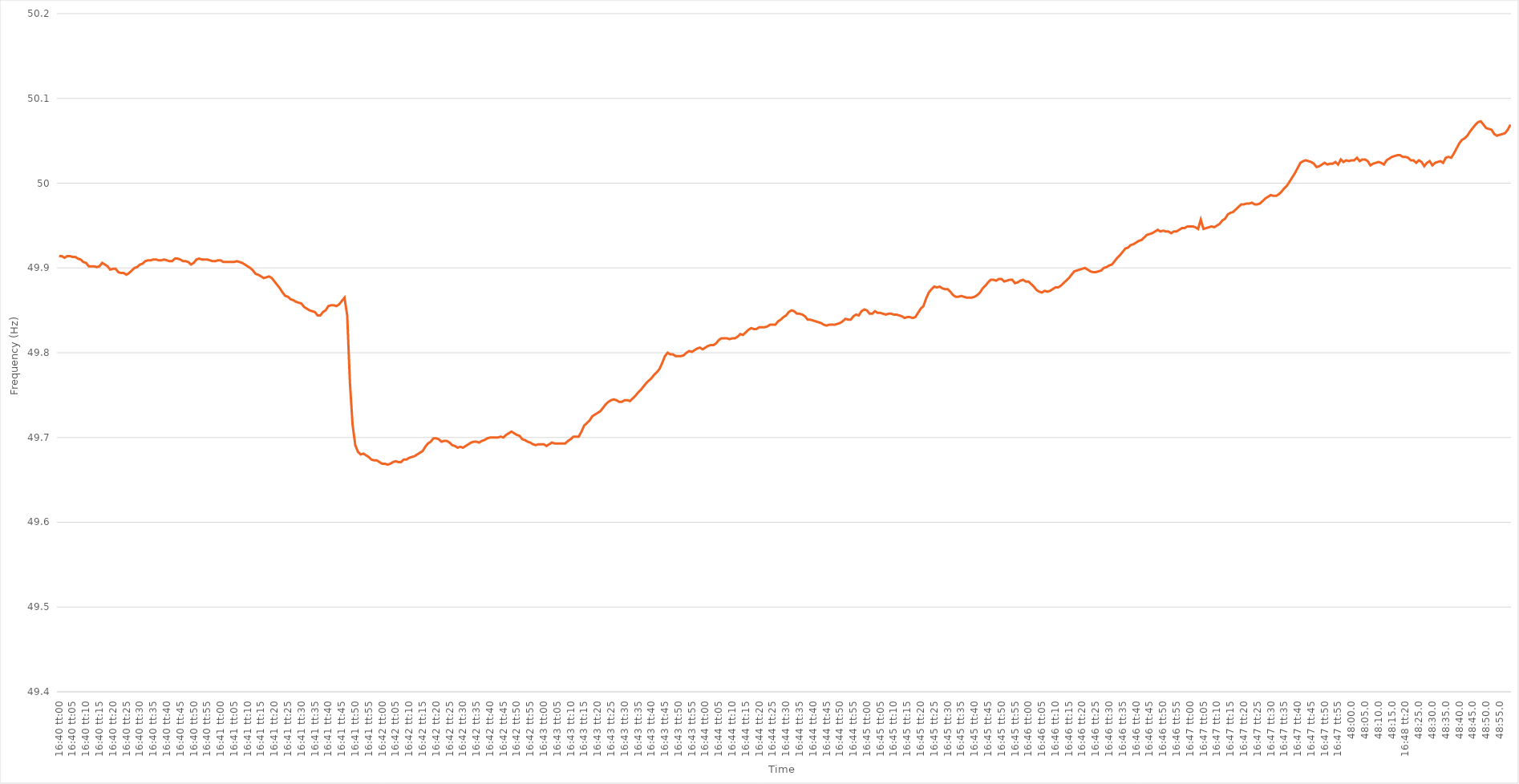
| Category | Series 0 |
|---|---|
| 0.6944444444444445 | 49.914 |
| 0.6944560185185185 | 49.914 |
| 0.6944675925925926 | 49.912 |
| 0.6944791666666666 | 49.914 |
| 0.6944907407407408 | 49.914 |
| 0.6945023148148147 | 49.913 |
| 0.6945138888888889 | 49.913 |
| 0.694525462962963 | 49.911 |
| 0.6945370370370371 | 49.91 |
| 0.6945486111111111 | 49.907 |
| 0.6945601851851851 | 49.906 |
| 0.6945717592592593 | 49.902 |
| 0.6945833333333334 | 49.902 |
| 0.6945949074074074 | 49.902 |
| 0.6946064814814815 | 49.901 |
| 0.6946180555555556 | 49.902 |
| 0.6946296296296296 | 49.906 |
| 0.6946412037037036 | 49.904 |
| 0.6946527777777778 | 49.902 |
| 0.6946643518518519 | 49.898 |
| 0.6946759259259259 | 49.899 |
| 0.6946875 | 49.899 |
| 0.694699074074074 | 49.895 |
| 0.6947106481481482 | 49.894 |
| 0.6947222222222221 | 49.894 |
| 0.6947337962962963 | 49.892 |
| 0.6947453703703704 | 49.894 |
| 0.6947569444444445 | 49.897 |
| 0.6947685185185185 | 49.9 |
| 0.6947800925925925 | 49.901 |
| 0.6947916666666667 | 49.904 |
| 0.6948032407407408 | 49.905 |
| 0.6948148148148148 | 49.908 |
| 0.6948263888888889 | 49.909 |
| 0.694837962962963 | 49.909 |
| 0.694849537037037 | 49.91 |
| 0.694861111111111 | 49.91 |
| 0.6948726851851852 | 49.909 |
| 0.6948842592592593 | 49.909 |
| 0.6948958333333333 | 49.91 |
| 0.6949074074074074 | 49.909 |
| 0.6949189814814815 | 49.908 |
| 0.6949305555555556 | 49.908 |
| 0.6949421296296295 | 49.911 |
| 0.6949537037037037 | 49.911 |
| 0.6949652777777778 | 49.91 |
| 0.6949768518518519 | 49.908 |
| 0.6949884259259259 | 49.908 |
| 0.695 | 49.907 |
| 0.6950115740740741 | 49.904 |
| 0.6950231481481483 | 49.906 |
| 0.6950347222222222 | 49.91 |
| 0.6950462962962963 | 49.911 |
| 0.6950578703703704 | 49.91 |
| 0.6950694444444444 | 49.91 |
| 0.6950810185185184 | 49.91 |
| 0.6950925925925926 | 49.909 |
| 0.6951041666666667 | 49.908 |
| 0.6951157407407407 | 49.908 |
| 0.6951273148148148 | 49.909 |
| 0.6951388888888889 | 49.909 |
| 0.695150462962963 | 49.907 |
| 0.6951620370370369 | 49.907 |
| 0.6951736111111111 | 49.907 |
| 0.6951851851851852 | 49.907 |
| 0.6951967592592593 | 49.907 |
| 0.6952083333333333 | 49.908 |
| 0.6952199074074074 | 49.907 |
| 0.6952314814814815 | 49.906 |
| 0.6952430555555557 | 49.904 |
| 0.6952546296296296 | 49.902 |
| 0.6952662037037037 | 49.9 |
| 0.6952777777777778 | 49.897 |
| 0.6952893518518519 | 49.893 |
| 0.6953009259259259 | 49.892 |
| 0.6953125 | 49.89 |
| 0.6953240740740741 | 49.888 |
| 0.6953356481481481 | 49.889 |
| 0.6953472222222222 | 49.89 |
| 0.6953587962962963 | 49.888 |
| 0.6953703703703704 | 49.884 |
| 0.6953819444444443 | 49.88 |
| 0.6953935185185185 | 49.876 |
| 0.6954050925925926 | 49.871 |
| 0.6954166666666667 | 49.867 |
| 0.6954282407407407 | 49.866 |
| 0.6954398148148148 | 49.863 |
| 0.6954513888888889 | 49.862 |
| 0.6954629629629631 | 49.86 |
| 0.695474537037037 | 49.859 |
| 0.6954861111111111 | 49.858 |
| 0.6954976851851852 | 49.854 |
| 0.6955092592592593 | 49.852 |
| 0.6955208333333333 | 49.85 |
| 0.6955324074074074 | 49.849 |
| 0.6955439814814816 | 49.848 |
| 0.6955555555555556 | 49.844 |
| 0.6955671296296296 | 49.844 |
| 0.6955787037037037 | 49.848 |
| 0.6955902777777778 | 49.85 |
| 0.6956018518518517 | 49.855 |
| 0.6956134259259259 | 49.856 |
| 0.695625 | 49.856 |
| 0.6956365740740741 | 49.855 |
| 0.6956481481481481 | 49.857 |
| 0.6956597222222222 | 49.861 |
| 0.6956712962962963 | 49.865 |
| 0.6956828703703705 | 49.844 |
| 0.6956944444444444 | 49.765 |
| 0.6957060185185185 | 49.715 |
| 0.6957175925925926 | 49.691 |
| 0.6957291666666667 | 49.683 |
| 0.6957407407407407 | 49.68 |
| 0.6957523148148148 | 49.681 |
| 0.695763888888889 | 49.679 |
| 0.695775462962963 | 49.677 |
| 0.695787037037037 | 49.674 |
| 0.6957986111111111 | 49.673 |
| 0.6958101851851852 | 49.673 |
| 0.6958217592592592 | 49.671 |
| 0.6958333333333333 | 49.669 |
| 0.6958449074074075 | 49.669 |
| 0.6958564814814815 | 49.668 |
| 0.6958680555555555 | 49.669 |
| 0.6958796296296296 | 49.671 |
| 0.6958912037037037 | 49.672 |
| 0.6959027777777779 | 49.671 |
| 0.6959143518518518 | 49.671 |
| 0.695925925925926 | 49.674 |
| 0.6959375 | 49.674 |
| 0.6959490740740741 | 49.676 |
| 0.6959606481481481 | 49.677 |
| 0.6959722222222222 | 49.678 |
| 0.6959837962962964 | 49.68 |
| 0.6959953703703704 | 49.682 |
| 0.6960069444444444 | 49.684 |
| 0.6960185185185185 | 49.689 |
| 0.6960300925925926 | 49.693 |
| 0.6960416666666666 | 49.695 |
| 0.6960532407407407 | 49.699 |
| 0.6960648148148149 | 49.699 |
| 0.6960763888888889 | 49.698 |
| 0.6960879629629629 | 49.695 |
| 0.696099537037037 | 49.696 |
| 0.6961111111111111 | 49.696 |
| 0.6961226851851853 | 49.694 |
| 0.6961342592592592 | 49.691 |
| 0.6961458333333334 | 49.69 |
| 0.6961574074074074 | 49.688 |
| 0.6961689814814815 | 49.689 |
| 0.6961805555555555 | 49.688 |
| 0.6961921296296296 | 49.69 |
| 0.6962037037037038 | 49.692 |
| 0.6962152777777778 | 49.694 |
| 0.6962268518518518 | 49.695 |
| 0.6962384259259259 | 49.695 |
| 0.69625 | 49.694 |
| 0.696261574074074 | 49.696 |
| 0.6962731481481481 | 49.697 |
| 0.6962847222222223 | 49.699 |
| 0.6962962962962963 | 49.7 |
| 0.6963078703703703 | 49.7 |
| 0.6963194444444444 | 49.7 |
| 0.6963310185185185 | 49.7 |
| 0.6963425925925927 | 49.701 |
| 0.6963541666666666 | 49.7 |
| 0.6963657407407408 | 49.703 |
| 0.6963773148148148 | 49.705 |
| 0.696388888888889 | 49.707 |
| 0.6964004629629629 | 49.705 |
| 0.696412037037037 | 49.703 |
| 0.6964236111111112 | 49.702 |
| 0.6964351851851852 | 49.698 |
| 0.6964467592592593 | 49.697 |
| 0.6964583333333333 | 49.695 |
| 0.6964699074074074 | 49.694 |
| 0.6964814814814814 | 49.692 |
| 0.6964930555555555 | 49.691 |
| 0.6965046296296297 | 49.692 |
| 0.6965162037037037 | 49.692 |
| 0.6965277777777777 | 49.692 |
| 0.6965393518518518 | 49.69 |
| 0.6965509259259259 | 49.692 |
| 0.6965625000000001 | 49.694 |
| 0.696574074074074 | 49.693 |
| 0.6965856481481482 | 49.693 |
| 0.6965972222222222 | 49.693 |
| 0.6966087962962964 | 49.693 |
| 0.6966203703703703 | 49.693 |
| 0.6966319444444444 | 49.696 |
| 0.6966435185185186 | 49.698 |
| 0.6966550925925926 | 49.701 |
| 0.6966666666666667 | 49.701 |
| 0.6966782407407407 | 49.701 |
| 0.6966898148148148 | 49.707 |
| 0.696701388888889 | 49.714 |
| 0.6967129629629629 | 49.717 |
| 0.6967245370370371 | 49.72 |
| 0.6967361111111111 | 49.725 |
| 0.6967476851851853 | 49.727 |
| 0.6967592592592592 | 49.729 |
| 0.6967708333333333 | 49.731 |
| 0.6967824074074075 | 49.735 |
| 0.6967939814814814 | 49.739 |
| 0.6968055555555556 | 49.742 |
| 0.6968171296296296 | 49.744 |
| 0.6968287037037038 | 49.745 |
| 0.6968402777777777 | 49.744 |
| 0.6968518518518518 | 49.742 |
| 0.696863425925926 | 49.742 |
| 0.696875 | 49.744 |
| 0.6968865740740741 | 49.744 |
| 0.6968981481481481 | 49.743 |
| 0.6969097222222222 | 49.746 |
| 0.6969212962962964 | 49.749 |
| 0.6969328703703703 | 49.753 |
| 0.6969444444444445 | 49.756 |
| 0.6969560185185185 | 49.76 |
| 0.6969675925925927 | 49.764 |
| 0.6969791666666666 | 49.767 |
| 0.6969907407407407 | 49.77 |
| 0.6970023148148149 | 49.774 |
| 0.6970138888888888 | 49.777 |
| 0.697025462962963 | 49.781 |
| 0.697037037037037 | 49.788 |
| 0.6970486111111112 | 49.796 |
| 0.6970601851851851 | 49.8 |
| 0.6970717592592592 | 49.798 |
| 0.6970833333333334 | 49.798 |
| 0.6970949074074074 | 49.796 |
| 0.6971064814814815 | 49.796 |
| 0.6971180555555555 | 49.796 |
| 0.6971296296296297 | 49.797 |
| 0.6971412037037038 | 49.8 |
| 0.6971527777777777 | 49.802 |
| 0.6971643518518519 | 49.801 |
| 0.6971759259259259 | 49.803 |
| 0.6971875000000001 | 49.805 |
| 0.697199074074074 | 49.806 |
| 0.6972106481481481 | 49.804 |
| 0.6972222222222223 | 49.806 |
| 0.6972337962962962 | 49.808 |
| 0.6972453703703704 | 49.809 |
| 0.6972569444444444 | 49.809 |
| 0.6972685185185186 | 49.811 |
| 0.6972800925925925 | 49.815 |
| 0.6972916666666666 | 49.817 |
| 0.6973032407407408 | 49.817 |
| 0.6973148148148148 | 49.817 |
| 0.6973263888888889 | 49.816 |
| 0.6973379629629629 | 49.817 |
| 0.6973495370370371 | 49.817 |
| 0.6973611111111112 | 49.819 |
| 0.6973726851851851 | 49.822 |
| 0.6973842592592593 | 49.821 |
| 0.6973958333333333 | 49.824 |
| 0.6974074074074075 | 49.827 |
| 0.6974189814814814 | 49.829 |
| 0.6974305555555556 | 49.828 |
| 0.6974421296296297 | 49.828 |
| 0.6974537037037036 | 49.83 |
| 0.6974652777777778 | 49.83 |
| 0.6974768518518518 | 49.83 |
| 0.697488425925926 | 49.831 |
| 0.6974999999999999 | 49.833 |
| 0.697511574074074 | 49.833 |
| 0.6975231481481482 | 49.833 |
| 0.6975347222222222 | 49.837 |
| 0.6975462962962963 | 49.839 |
| 0.6975578703703703 | 49.842 |
| 0.6975694444444445 | 49.844 |
| 0.6975810185185186 | 49.848 |
| 0.6975925925925925 | 49.85 |
| 0.6976041666666667 | 49.849 |
| 0.6976157407407407 | 49.846 |
| 0.6976273148148149 | 49.846 |
| 0.6976388888888888 | 49.845 |
| 0.697650462962963 | 49.843 |
| 0.6976620370370371 | 49.839 |
| 0.697673611111111 | 49.839 |
| 0.6976851851851852 | 49.838 |
| 0.6976967592592592 | 49.837 |
| 0.6977083333333334 | 49.836 |
| 0.6977199074074073 | 49.835 |
| 0.6977314814814815 | 49.833 |
| 0.6977430555555556 | 49.832 |
| 0.6977546296296296 | 49.833 |
| 0.6977662037037037 | 49.833 |
| 0.6977777777777777 | 49.833 |
| 0.6977893518518519 | 49.834 |
| 0.697800925925926 | 49.835 |
| 0.6978125 | 49.837 |
| 0.6978240740740741 | 49.84 |
| 0.6978356481481481 | 49.839 |
| 0.6978472222222223 | 49.839 |
| 0.6978587962962962 | 49.843 |
| 0.6978703703703704 | 49.845 |
| 0.6978819444444445 | 49.844 |
| 0.6978935185185186 | 49.849 |
| 0.6979050925925926 | 49.851 |
| 0.6979166666666666 | 49.85 |
| 0.6979282407407408 | 49.846 |
| 0.6979398148148147 | 49.846 |
| 0.6979513888888889 | 49.849 |
| 0.697962962962963 | 49.847 |
| 0.697974537037037 | 49.847 |
| 0.6979861111111111 | 49.846 |
| 0.6979976851851851 | 49.845 |
| 0.6980092592592593 | 49.846 |
| 0.6980208333333334 | 49.846 |
| 0.6980324074074074 | 49.845 |
| 0.6980439814814815 | 49.845 |
| 0.6980555555555555 | 49.844 |
| 0.6980671296296297 | 49.843 |
| 0.6980787037037036 | 49.841 |
| 0.6980902777777778 | 49.842 |
| 0.6981018518518519 | 49.842 |
| 0.698113425925926 | 49.841 |
| 0.698125 | 49.842 |
| 0.698136574074074 | 49.847 |
| 0.6981481481481482 | 49.852 |
| 0.6981597222222223 | 49.855 |
| 0.6981712962962963 | 49.864 |
| 0.6981828703703704 | 49.871 |
| 0.6981944444444445 | 49.875 |
| 0.6982060185185185 | 49.878 |
| 0.6982175925925925 | 49.877 |
| 0.6982291666666667 | 49.878 |
| 0.6982407407407408 | 49.876 |
| 0.6982523148148148 | 49.875 |
| 0.6982638888888889 | 49.875 |
| 0.698275462962963 | 49.872 |
| 0.6982870370370371 | 49.868 |
| 0.698298611111111 | 49.866 |
| 0.6983101851851852 | 49.866 |
| 0.6983217592592593 | 49.867 |
| 0.6983333333333334 | 49.866 |
| 0.6983449074074074 | 49.865 |
| 0.6983564814814814 | 49.865 |
| 0.6983680555555556 | 49.865 |
| 0.6983796296296297 | 49.866 |
| 0.6983912037037037 | 49.868 |
| 0.6984027777777778 | 49.871 |
| 0.6984143518518519 | 49.876 |
| 0.6984259259259259 | 49.879 |
| 0.6984374999999999 | 49.883 |
| 0.6984490740740741 | 49.886 |
| 0.6984606481481482 | 49.886 |
| 0.6984722222222222 | 49.885 |
| 0.6984837962962963 | 49.887 |
| 0.6984953703703703 | 49.887 |
| 0.6985069444444445 | 49.884 |
| 0.6985185185185184 | 49.885 |
| 0.6985300925925926 | 49.886 |
| 0.6985416666666667 | 49.886 |
| 0.6985532407407408 | 49.882 |
| 0.6985648148148148 | 49.883 |
| 0.6985763888888888 | 49.885 |
| 0.698587962962963 | 49.886 |
| 0.6985995370370371 | 49.884 |
| 0.6986111111111111 | 49.884 |
| 0.6986226851851852 | 49.881 |
| 0.6986342592592593 | 49.878 |
| 0.6986458333333333 | 49.874 |
| 0.6986574074074073 | 49.872 |
| 0.6986689814814815 | 49.871 |
| 0.6986805555555556 | 49.873 |
| 0.6986921296296296 | 49.872 |
| 0.6987037037037037 | 49.873 |
| 0.6987152777777778 | 49.875 |
| 0.6987268518518519 | 49.877 |
| 0.6987384259259258 | 49.877 |
| 0.69875 | 49.879 |
| 0.6987615740740741 | 49.882 |
| 0.6987731481481482 | 49.885 |
| 0.6987847222222222 | 49.888 |
| 0.6987962962962962 | 49.892 |
| 0.6988078703703704 | 49.896 |
| 0.6988194444444445 | 49.897 |
| 0.6988310185185185 | 49.898 |
| 0.6988425925925926 | 49.899 |
| 0.6988541666666667 | 49.9 |
| 0.6988657407407407 | 49.898 |
| 0.6988773148148147 | 49.896 |
| 0.6988888888888889 | 49.895 |
| 0.698900462962963 | 49.895 |
| 0.698912037037037 | 49.896 |
| 0.6989236111111111 | 49.897 |
| 0.6989351851851852 | 49.9 |
| 0.6989467592592593 | 49.901 |
| 0.6989583333333332 | 49.903 |
| 0.6989699074074074 | 49.904 |
| 0.6989814814814815 | 49.908 |
| 0.6989930555555556 | 49.912 |
| 0.6990046296296296 | 49.915 |
| 0.6990162037037037 | 49.919 |
| 0.6990277777777778 | 49.923 |
| 0.699039351851852 | 49.924 |
| 0.6990509259259259 | 49.927 |
| 0.6990625 | 49.928 |
| 0.6990740740740741 | 49.93 |
| 0.6990856481481481 | 49.932 |
| 0.6990972222222221 | 49.933 |
| 0.6991087962962963 | 49.936 |
| 0.6991203703703704 | 49.939 |
| 0.6991319444444444 | 49.94 |
| 0.6991435185185185 | 49.941 |
| 0.6991550925925926 | 49.943 |
| 0.6991666666666667 | 49.945 |
| 0.6991782407407406 | 49.943 |
| 0.6991898148148148 | 49.944 |
| 0.6992013888888889 | 49.943 |
| 0.699212962962963 | 49.943 |
| 0.699224537037037 | 49.941 |
| 0.6992361111111111 | 49.943 |
| 0.6992476851851852 | 49.943 |
| 0.6992592592592594 | 49.945 |
| 0.6992708333333333 | 49.947 |
| 0.6992824074074074 | 49.947 |
| 0.6992939814814815 | 49.949 |
| 0.6993055555555556 | 49.949 |
| 0.6993171296296296 | 49.949 |
| 0.6993287037037037 | 49.948 |
| 0.6993402777777779 | 49.946 |
| 0.6993518518518519 | 49.957 |
| 0.6993634259259259 | 49.946 |
| 0.699375 | 49.947 |
| 0.6993865740740741 | 49.948 |
| 0.699398148148148 | 49.949 |
| 0.6994097222222222 | 49.948 |
| 0.6994212962962963 | 49.95 |
| 0.6994328703703704 | 49.952 |
| 0.6994444444444444 | 49.956 |
| 0.6994560185185185 | 49.958 |
| 0.6994675925925926 | 49.963 |
| 0.6994791666666668 | 49.965 |
| 0.6994907407407407 | 49.966 |
| 0.6995023148148148 | 49.969 |
| 0.6995138888888889 | 49.972 |
| 0.699525462962963 | 49.975 |
| 0.699537037037037 | 49.975 |
| 0.6995486111111111 | 49.976 |
| 0.6995601851851853 | 49.976 |
| 0.6995717592592593 | 49.977 |
| 0.6995833333333333 | 49.975 |
| 0.6995949074074074 | 49.975 |
| 0.6996064814814815 | 49.976 |
| 0.6996180555555555 | 49.979 |
| 0.6996296296296296 | 49.982 |
| 0.6996412037037038 | 49.984 |
| 0.6996527777777778 | 49.986 |
| 0.6996643518518518 | 49.985 |
| 0.6996759259259259 | 49.985 |
| 0.6996875 | 49.987 |
| 0.6996990740740742 | 49.99 |
| 0.6997106481481481 | 49.994 |
| 0.6997222222222222 | 49.997 |
| 0.6997337962962963 | 50.002 |
| 0.6997453703703704 | 50.007 |
| 0.6997569444444444 | 50.012 |
| 0.6997685185185185 | 50.018 |
| 0.6997800925925927 | 50.024 |
| 0.6997916666666667 | 50.026 |
| 0.6998032407407407 | 50.027 |
| 0.6998148148148148 | 50.026 |
| 0.6998263888888889 | 50.025 |
| 0.6998379629629629 | 50.023 |
| 0.699849537037037 | 50.019 |
| 0.6998611111111112 | 50.02 |
| 0.6998726851851852 | 50.022 |
| 0.6998842592592592 | 50.024 |
| 0.6998958333333333 | 50.022 |
| 0.6999074074074074 | 50.023 |
| 0.6999189814814816 | 50.023 |
| 0.6999305555555555 | 50.025 |
| 0.6999421296296297 | 50.022 |
| 0.6999537037037037 | 50.028 |
| 0.6999652777777778 | 50.025 |
| 0.6999768518518518 | 50.027 |
| 0.6999884259259259 | 50.026 |
| 0.7000000000000001 | 50.027 |
| 0.7000115740740741 | 50.027 |
| 0.7000231481481481 | 50.03 |
| 0.7000347222222222 | 50.026 |
| 0.7000462962962963 | 50.028 |
| 0.7000578703703703 | 50.028 |
| 0.7000694444444444 | 50.026 |
| 0.7000810185185186 | 50.021 |
| 0.7000925925925926 | 50.023 |
| 0.7001041666666666 | 50.024 |
| 0.7001157407407407 | 50.025 |
| 0.7001273148148148 | 50.024 |
| 0.700138888888889 | 50.022 |
| 0.7001504629629629 | 50.027 |
| 0.700162037037037 | 50.029 |
| 0.7001736111111111 | 50.031 |
| 0.7001851851851852 | 50.032 |
| 0.7001967592592592 | 50.033 |
| 0.7002083333333333 | 50.033 |
| 0.7002199074074075 | 50.031 |
| 0.7002314814814815 | 50.031 |
| 0.7002430555555555 | 50.03 |
| 0.7002546296296296 | 50.027 |
| 0.7002662037037037 | 50.027 |
| 0.7002777777777777 | 50.024 |
| 0.7002893518518518 | 50.027 |
| 0.700300925925926 | 50.025 |
| 0.7003125 | 50.02 |
| 0.700324074074074 | 50.024 |
| 0.7003356481481481 | 50.026 |
| 0.7003472222222222 | 50.021 |
| 0.7003587962962964 | 50.024 |
| 0.7003703703703703 | 50.025 |
| 0.7003819444444445 | 50.026 |
| 0.7003935185185185 | 50.024 |
| 0.7004050925925926 | 50.03 |
| 0.7004166666666666 | 50.031 |
| 0.7004282407407407 | 50.03 |
| 0.7004398148148149 | 50.035 |
| 0.7004513888888889 | 50.041 |
| 0.700462962962963 | 50.047 |
| 0.700474537037037 | 50.051 |
| 0.7004861111111111 | 50.053 |
| 0.7004976851851853 | 50.056 |
| 0.7005092592592592 | 50.061 |
| 0.7005208333333334 | 50.065 |
| 0.7005324074074074 | 50.069 |
| 0.7005439814814814 | 50.072 |
| 0.7005555555555555 | 50.073 |
| 0.7005671296296296 | 50.069 |
| 0.7005787037037038 | 50.065 |
| 0.7005902777777777 | 50.064 |
| 0.7006018518518519 | 50.063 |
| 0.7006134259259259 | 50.058 |
| 0.700625 | 50.056 |
| 0.700636574074074 | 50.057 |
| 0.7006481481481481 | 50.058 |
| 0.7006597222222223 | 50.059 |
| 0.7006712962962963 | 50.063 |
| 0.7006828703703704 | 50.069 |